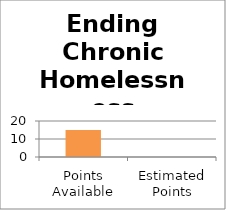
| Category | Ending Chronic Homelessness |
|---|---|
| Points Available | 15 |
| Estimated Points | 0 |